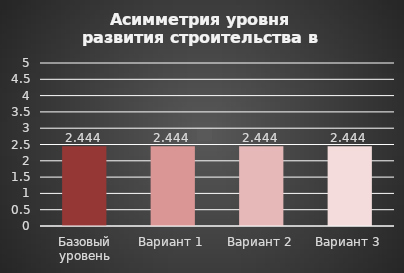
| Category | Асимметрия уровня развития строительства |
|---|---|
| Базовый уровень | 2.444 |
| Вариант 1 | 2.444 |
| Вариант 2 | 2.444 |
| Вариант 3 | 2.444 |